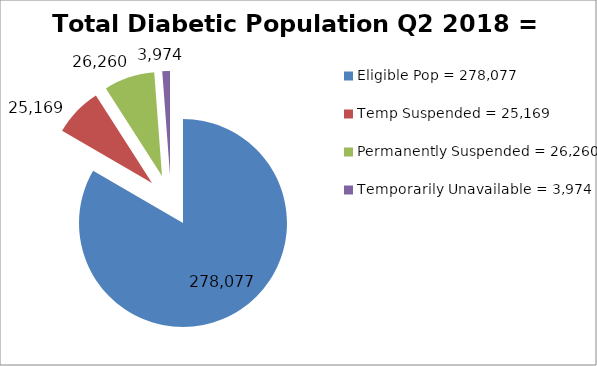
| Category | Total Diabetic Population Q2 2018 = 325,532 |
|---|---|
| Eligible Pop = 278,077 | 278077 |
| Temp Suspended = 25,169 | 25169 |
| Permanently Suspended = 26,260 | 26260 |
| Temporarily Unavailable = 3,974 | 3974 |